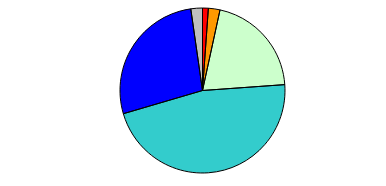
| Category | Series 0 |
|---|---|
| 0 | 2 |
| 1 | 4 |
| 2 | 36 |
| 3 | 82 |
| 4 | 48 |
| 5 | 4 |